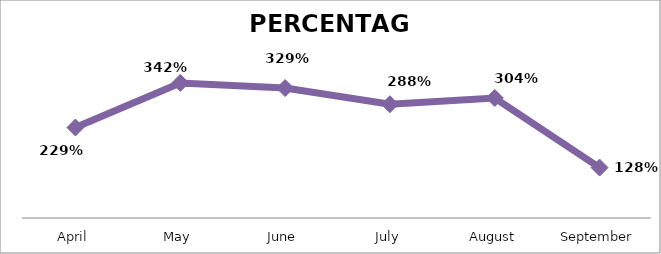
| Category | PERCENTAGE |
|---|---|
| April | 2.289 |
| May | 3.42 |
| June | 3.289 |
| July | 2.88 |
| August | 3.039 |
| September | 1.276 |